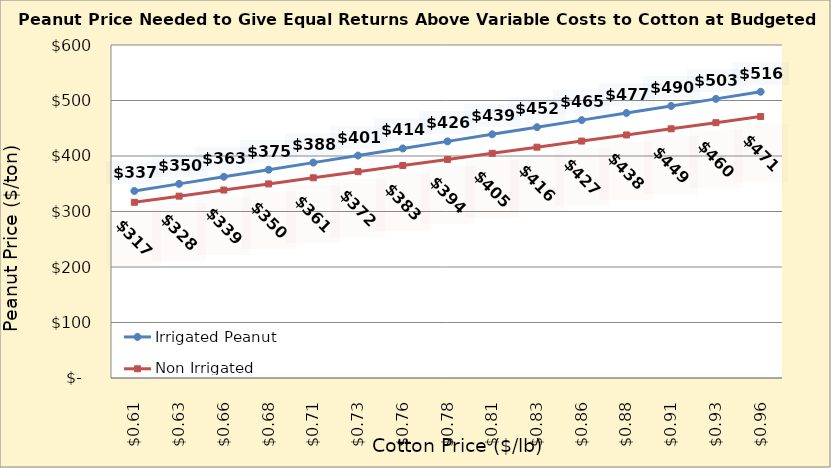
| Category | Irrigated Peanut | Non Irrigated Peanut |
|---|---|---|
| 0.6049999999999999 | 336.999 | 316.624 |
| 0.6299999999999999 | 349.765 | 327.654 |
| 0.6549999999999999 | 362.531 | 338.683 |
| 0.6799999999999999 | 375.297 | 349.712 |
| 0.705 | 388.063 | 360.742 |
| 0.73 | 400.829 | 371.771 |
| 0.755 | 413.595 | 382.801 |
| 0.78 | 426.361 | 393.83 |
| 0.805 | 439.127 | 404.859 |
| 0.8300000000000001 | 451.893 | 415.889 |
| 0.8550000000000001 | 464.659 | 426.918 |
| 0.8800000000000001 | 477.425 | 437.948 |
| 0.9050000000000001 | 490.191 | 448.977 |
| 0.9300000000000002 | 502.957 | 460.006 |
| 0.9550000000000002 | 515.723 | 471.036 |